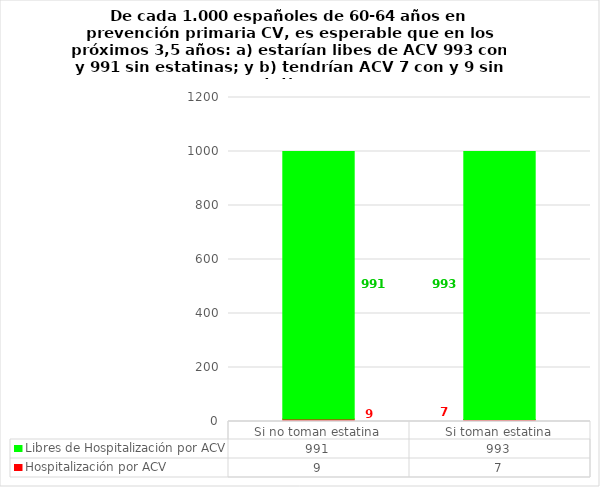
| Category | Hospitalización por ACV | Libres de Hospitalización por ACV |
|---|---|---|
| Si no toman estatina | 9 | 991 |
| Si toman estatina | 7 | 993 |